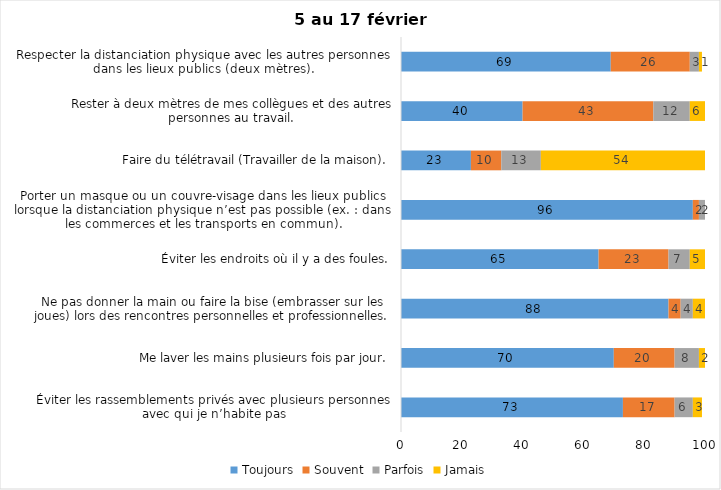
| Category | Toujours | Souvent | Parfois | Jamais |
|---|---|---|---|---|
| Éviter les rassemblements privés avec plusieurs personnes avec qui je n’habite pas | 73 | 17 | 6 | 3 |
| Me laver les mains plusieurs fois par jour. | 70 | 20 | 8 | 2 |
| Ne pas donner la main ou faire la bise (embrasser sur les joues) lors des rencontres personnelles et professionnelles. | 88 | 4 | 4 | 4 |
| Éviter les endroits où il y a des foules. | 65 | 23 | 7 | 5 |
| Porter un masque ou un couvre-visage dans les lieux publics lorsque la distanciation physique n’est pas possible (ex. : dans les commerces et les transports en commun). | 96 | 2 | 2 | 0 |
| Faire du télétravail (Travailler de la maison). | 23 | 10 | 13 | 54 |
| Rester à deux mètres de mes collègues et des autres personnes au travail. | 40 | 43 | 12 | 6 |
| Respecter la distanciation physique avec les autres personnes dans les lieux publics (deux mètres). | 69 | 26 | 3 | 1 |